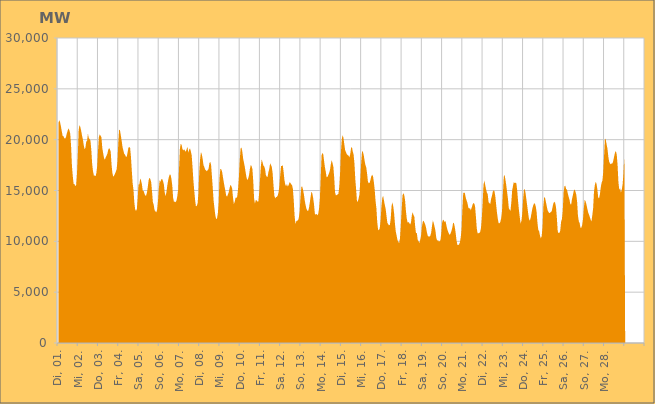
| Category | Series 0 |
|---|---|
|  Di, 01.  | 21647.382 |
|  Di, 01.  | 21924.594 |
|  Di, 01.  | 21709.314 |
|  Di, 01.  | 21294.105 |
|  Di, 01.  | 20818.8 |
|  Di, 01.  | 20381.168 |
|  Di, 01.  | 20331.088 |
|  Di, 01.  | 20152.958 |
|  Di, 01.  | 20108.019 |
|  Di, 01.  | 20274.073 |
|  Di, 01.  | 20621.172 |
|  Di, 01.  | 20891.026 |
|  Di, 01.  | 21119.57 |
|  Di, 01.  | 20923.959 |
|  Di, 01.  | 20590.216 |
|  Di, 01.  | 19414.576 |
|  Di, 01.  | 17480.923 |
|  Mi, 02.  | 16425.325 |
|  Mi, 02.  | 15656.243 |
|  Mi, 02.  | 15633.18 |
|  Mi, 02.  | 15427.669 |
|  Mi, 02.  | 15548.343 |
|  Mi, 02.  | 16637.939 |
|  Mi, 02.  | 18485.272 |
|  Mi, 02.  | 20947.899 |
|  Mi, 02.  | 21448.928 |
|  Mi, 02.  | 21230.439 |
|  Mi, 02.  | 20867.877 |
|  Mi, 02.  | 20397.562 |
|  Mi, 02.  | 20023.071 |
|  Mi, 02.  | 19468.186 |
|  Mi, 02.  | 19064.334 |
|  Mi, 02.  | 19200.474 |
|  Mi, 02.  | 19810.049 |
|  Mi, 02.  | 19894.203 |
|  Mi, 02.  | 20596.826 |
|  Mi, 02.  | 20157.907 |
|  Mi, 02.  | 20075.829 |
|  Mi, 02.  | 19888.825 |
|  Mi, 02.  | 18993.205 |
|  Mi, 02.  | 17620.818 |
|  Do, 03.  | 16895.106 |
|  Do, 03.  | 16479.599 |
|  Do, 03.  | 16473.779 |
|  Do, 03.  | 16400.937 |
|  Do, 03.  | 16718.662 |
|  Do, 03.  | 17426.035 |
|  Do, 03.  | 18963.022 |
|  Do, 03.  | 20262.915 |
|  Do, 03.  | 20519.092 |
|  Do, 03.  | 20385.887 |
|  Do, 03.  | 20235.364 |
|  Do, 03.  | 19189.385 |
|  Do, 03.  | 18699.432 |
|  Do, 03.  | 18212.272 |
|  Do, 03.  | 18027.207 |
|  Do, 03.  | 18242.721 |
|  Do, 03.  | 18424.277 |
|  Do, 03.  | 18601.874 |
|  Do, 03.  | 18983.966 |
|  Do, 03.  | 19169.987 |
|  Do, 03.  | 19069.583 |
|  Do, 03.  | 18812.379 |
|  Do, 03.  | 17520.781 |
|  Do, 03.  | 16715.254 |
|  Fr, 04.  | 16350.941 |
|  Fr, 04.  | 16457.751 |
|  Fr, 04.  | 16642.461 |
|  Fr, 04.  | 16826.842 |
|  Fr, 04.  | 17081.881 |
|  Fr, 04.  | 17864.784 |
|  Fr, 04.  | 19688.729 |
|  Fr, 04.  | 20986.734 |
|  Fr, 04.  | 20910.923 |
|  Fr, 04.  | 20420.928 |
|  Fr, 04.  | 19885.365 |
|  Fr, 04.  | 19273.606 |
|  Fr, 04.  | 18933.802 |
|  Fr, 04.  | 18609.294 |
|  Fr, 04.  | 18519.89 |
|  Fr, 04.  | 18317.522 |
|  Fr, 04.  | 18332.433 |
|  Fr, 04.  | 18739.221 |
|  Fr, 04.  | 19208.058 |
|  Fr, 04.  | 19278.517 |
|  Fr, 04.  | 19188.406 |
|  Fr, 04.  | 18313.067 |
|  Fr, 04.  | 16975.028 |
|  Fr, 04.  | 15734.214 |
|  Sa, 05.  | 15073.215 |
|  Sa, 05.  | 13826.937 |
|  Sa, 05.  | 13146.168 |
|  Sa, 05.  | 12989.51 |
|  Sa, 05.  | 13188.031 |
|  Sa, 05.  | 14250.862 |
|  Sa, 05.  | 15579.951 |
|  Sa, 05.  | 15614.937 |
|  Sa, 05.  | 16192.824 |
|  Sa, 05.  | 15970.28 |
|  Sa, 05.  | 15607.055 |
|  Sa, 05.  | 14961.727 |
|  Sa, 05.  | 14950.787 |
|  Sa, 05.  | 14699.195 |
|  Sa, 05.  | 14483.501 |
|  Sa, 05.  | 14516.205 |
|  Sa, 05.  | 14802.24 |
|  Sa, 05.  | 15371.821 |
|  Sa, 05.  | 16032.172 |
|  Sa, 05.  | 16255.178 |
|  Sa, 05.  | 16119.198 |
|  Sa, 05.  | 15805.163 |
|  Sa, 05.  | 14888.755 |
|  Sa, 05.  | 13863.611 |
|  So, 06.  | 13583.174 |
|  So, 06.  | 13062.539 |
|  So, 06.  | 12962.737 |
|  So, 06.  | 12839.903 |
|  So, 06.  | 13102.004 |
|  So, 06.  | 13899.438 |
|  So, 06.  | 15122.044 |
|  So, 06.  | 15992.378 |
|  So, 06.  | 15848.781 |
|  So, 06.  | 16106.19 |
|  So, 06.  | 16135.989 |
|  So, 06.  | 15925.278 |
|  So, 06.  | 15620.938 |
|  So, 06.  | 14829.078 |
|  So, 06.  | 14434.942 |
|  So, 06.  | 14802.797 |
|  So, 06.  | 15434.808 |
|  So, 06.  | 15951.464 |
|  So, 06.  | 16339.908 |
|  So, 06.  | 16584.075 |
|  So, 06.  | 16539.416 |
|  So, 06.  | 16148.309 |
|  So, 06.  | 15472.107 |
|  So, 06.  | 14276.879 |
|  Mo, 07.  | 13864.22 |
|  Mo, 07.  | 13922.796 |
|  Mo, 07.  | 13850.88 |
|  Mo, 07.  | 14017.996 |
|  Mo, 07.  | 14451.597 |
|  Mo, 07.  | 15100.453 |
|  Mo, 07.  | 17116.972 |
|  Mo, 07.  | 19071.451 |
|  Mo, 07.  | 19590.066 |
|  Mo, 07.  | 19498.177 |
|  Mo, 07.  | 19095.235 |
|  Mo, 07.  | 18927.247 |
|  Mo, 07.  | 19069.059 |
|  Mo, 07.  | 18917.665 |
|  Mo, 07.  | 18806.779 |
|  Mo, 07.  | 19063.222 |
|  Mo, 07.  | 19292.183 |
|  Mo, 07.  | 18718.956 |
|  Mo, 07.  | 19009.22 |
|  Mo, 07.  | 19146.582 |
|  Mo, 07.  | 18863.678 |
|  Mo, 07.  | 18462.515 |
|  Mo, 07.  | 17321.467 |
|  Mo, 07.  | 16014.796 |
|  Di, 08.  | 15031.501 |
|  Di, 08.  | 14110.373 |
|  Di, 08.  | 13456.405 |
|  Di, 08.  | 13474.461 |
|  Di, 08.  | 13717.189 |
|  Di, 08.  | 14689.085 |
|  Di, 08.  | 16834.872 |
|  Di, 08.  | 18091.872 |
|  Di, 08.  | 18777.328 |
|  Di, 08.  | 18563.255 |
|  Di, 08.  | 18117.438 |
|  Di, 08.  | 17493.964 |
|  Di, 08.  | 17304.059 |
|  Di, 08.  | 17055.066 |
|  Di, 08.  | 16967.131 |
|  Di, 08.  | 16895.187 |
|  Di, 08.  | 17007.212 |
|  Di, 08.  | 17125.69 |
|  Di, 08.  | 17679.714 |
|  Di, 08.  | 17814.447 |
|  Di, 08.  | 17537.798 |
|  Di, 08.  | 16418.18 |
|  Di, 08.  | 15249.092 |
|  Di, 08.  | 14001.512 |
|  Mi, 09.  | 13264.465 |
|  Mi, 09.  | 12583.615 |
|  Mi, 09.  | 12197.608 |
|  Mi, 09.  | 12248.391 |
|  Mi, 09.  | 12717.885 |
|  Mi, 09.  | 13805.939 |
|  Mi, 09.  | 16202.71 |
|  Mi, 09.  | 17112.278 |
|  Mi, 09.  | 17096.809 |
|  Mi, 09.  | 16867.138 |
|  Mi, 09.  | 16358.865 |
|  Mi, 09.  | 15850.386 |
|  Mi, 09.  | 15372.133 |
|  Mi, 09.  | 14942.417 |
|  Mi, 09.  | 14475.801 |
|  Mi, 09.  | 14407.27 |
|  Mi, 09.  | 14620.496 |
|  Mi, 09.  | 14842.471 |
|  Mi, 09.  | 15264.154 |
|  Mi, 09.  | 15564.447 |
|  Mi, 09.  | 15431.573 |
|  Mi, 09.  | 15179.759 |
|  Mi, 09.  | 14305.825 |
|  Mi, 09.  | 13668.996 |
|  Do, 10.  | 13875.519 |
|  Do, 10.  | 14293.174 |
|  Do, 10.  | 14271.768 |
|  Do, 10.  | 14386.692 |
|  Do, 10.  | 15153.697 |
|  Do, 10.  | 16319.373 |
|  Do, 10.  | 18001.158 |
|  Do, 10.  | 19117.569 |
|  Do, 10.  | 19232.245 |
|  Do, 10.  | 18857.538 |
|  Do, 10.  | 18160.432 |
|  Do, 10.  | 17744.402 |
|  Do, 10.  | 17303.408 |
|  Do, 10.  | 16777.248 |
|  Do, 10.  | 16282.428 |
|  Do, 10.  | 16025.547 |
|  Do, 10.  | 16186.261 |
|  Do, 10.  | 16512.235 |
|  Do, 10.  | 17102.39 |
|  Do, 10.  | 17501.986 |
|  Do, 10.  | 17408.855 |
|  Do, 10.  | 17114.141 |
|  Do, 10.  | 15924.647 |
|  Do, 10.  | 14226.712 |
|  Fr, 11.  | 13705.592 |
|  Fr, 11.  | 14058.838 |
|  Fr, 11.  | 14042.868 |
|  Fr, 11.  | 13915.292 |
|  Fr, 11.  | 13883.156 |
|  Fr, 11.  | 14741.415 |
|  Fr, 11.  | 16020.871 |
|  Fr, 11.  | 17354.857 |
|  Fr, 11.  | 18055.156 |
|  Fr, 11.  | 17793.744 |
|  Fr, 11.  | 17468.15 |
|  Fr, 11.  | 17366.93 |
|  Fr, 11.  | 17123.497 |
|  Fr, 11.  | 16512.652 |
|  Fr, 11.  | 16353.893 |
|  Fr, 11.  | 16337.599 |
|  Fr, 11.  | 16812.537 |
|  Fr, 11.  | 17112.818 |
|  Fr, 11.  | 17665.426 |
|  Fr, 11.  | 17527.426 |
|  Fr, 11.  | 17316.175 |
|  Fr, 11.  | 16693.461 |
|  Fr, 11.  | 15521.166 |
|  Fr, 11.  | 14509.934 |
|  Sa, 12.  | 14227.514 |
|  Sa, 12.  | 14347.255 |
|  Sa, 12.  | 14381.564 |
|  Sa, 12.  | 14497.925 |
|  Sa, 12.  | 14803.936 |
|  Sa, 12.  | 15479.31 |
|  Sa, 12.  | 16540.263 |
|  Sa, 12.  | 17417.751 |
|  Sa, 12.  | 17414.688 |
|  Sa, 12.  | 17484.71 |
|  Sa, 12.  | 16841.518 |
|  Sa, 12.  | 16019.939 |
|  Sa, 12.  | 15570.544 |
|  Sa, 12.  | 15434.521 |
|  Sa, 12.  | 15641.264 |
|  Sa, 12.  | 15394.087 |
|  Sa, 12.  | 15557.336 |
|  Sa, 12.  | 15807.191 |
|  Sa, 12.  | 15755.996 |
|  Sa, 12.  | 15614.142 |
|  Sa, 12.  | 15539.582 |
|  Sa, 12.  | 15159.591 |
|  Sa, 12.  | 14059.037 |
|  Sa, 12.  | 12541.84 |
|  So, 13.  | 11725.372 |
|  So, 13.  | 11952.351 |
|  So, 13.  | 12051.085 |
|  So, 13.  | 12056.506 |
|  So, 13.  | 12289.501 |
|  So, 13.  | 12935.653 |
|  So, 13.  | 14279.327 |
|  So, 13.  | 15350.799 |
|  So, 13.  | 15401.172 |
|  So, 13.  | 15092.121 |
|  So, 13.  | 14648.718 |
|  So, 13.  | 14054.978 |
|  So, 13.  | 13593.78 |
|  So, 13.  | 13227.322 |
|  So, 13.  | 13032.57 |
|  So, 13.  | 12970.881 |
|  So, 13.  | 13253.171 |
|  So, 13.  | 13761.175 |
|  So, 13.  | 14360.168 |
|  So, 13.  | 14893.073 |
|  So, 13.  | 14724.573 |
|  So, 13.  | 14281.528 |
|  So, 13.  | 13673.685 |
|  So, 13.  | 12761.172 |
|  Mo, 14.  | 12598.055 |
|  Mo, 14.  | 12714.341 |
|  Mo, 14.  | 12553.454 |
|  Mo, 14.  | 12706.545 |
|  Mo, 14.  | 13190.024 |
|  Mo, 14.  | 14162.038 |
|  Mo, 14.  | 16227.041 |
|  Mo, 14.  | 18434.471 |
|  Mo, 14.  | 18694.304 |
|  Mo, 14.  | 18565.88 |
|  Mo, 14.  | 17903.078 |
|  Mo, 14.  | 17278.436 |
|  Mo, 14.  | 16842.372 |
|  Mo, 14.  | 16308.302 |
|  Mo, 14.  | 16332.108 |
|  Mo, 14.  | 16537.321 |
|  Mo, 14.  | 16726.971 |
|  Mo, 14.  | 17030.077 |
|  Mo, 14.  | 17586.473 |
|  Mo, 14.  | 17982.098 |
|  Mo, 14.  | 17701.961 |
|  Mo, 14.  | 17320.135 |
|  Mo, 14.  | 16266.186 |
|  Mo, 14.  | 14809.015 |
|  Di, 15.  | 14522.789 |
|  Di, 15.  | 14554.233 |
|  Di, 15.  | 14614.662 |
|  Di, 15.  | 14682.728 |
|  Di, 15.  | 15386.58 |
|  Di, 15.  | 16769.18 |
|  Di, 15.  | 18834.725 |
|  Di, 15.  | 20057.012 |
|  Di, 15.  | 20444.541 |
|  Di, 15.  | 20169.485 |
|  Di, 15.  | 19524.191 |
|  Di, 15.  | 18963.414 |
|  Di, 15.  | 18754.175 |
|  Di, 15.  | 18569.478 |
|  Di, 15.  | 18478.207 |
|  Di, 15.  | 18427.359 |
|  Di, 15.  | 18261.085 |
|  Di, 15.  | 18581.723 |
|  Di, 15.  | 19167.789 |
|  Di, 15.  | 19285.603 |
|  Di, 15.  | 18829.329 |
|  Di, 15.  | 18539.425 |
|  Di, 15.  | 17661.985 |
|  Di, 15.  | 16123.459 |
|  Mi, 16.  | 15099.376 |
|  Mi, 16.  | 13909.412 |
|  Mi, 16.  | 13922.851 |
|  Mi, 16.  | 14222.198 |
|  Mi, 16.  | 14646.028 |
|  Mi, 16.  | 16161.638 |
|  Mi, 16.  | 17769.606 |
|  Mi, 16.  | 18857.937 |
|  Mi, 16.  | 18821.583 |
|  Mi, 16.  | 18476.907 |
|  Mi, 16.  | 17943.143 |
|  Mi, 16.  | 17513.804 |
|  Mi, 16.  | 17278.224 |
|  Mi, 16.  | 16642.961 |
|  Mi, 16.  | 15867.54 |
|  Mi, 16.  | 15716.885 |
|  Mi, 16.  | 15760.006 |
|  Mi, 16.  | 16044.298 |
|  Mi, 16.  | 16411.108 |
|  Mi, 16.  | 16543.577 |
|  Mi, 16.  | 16415.772 |
|  Mi, 16.  | 15834.362 |
|  Mi, 16.  | 15087.013 |
|  Mi, 16.  | 13984.838 |
|  Do, 17.  | 13276.2 |
|  Do, 17.  | 11908.005 |
|  Do, 17.  | 11170.978 |
|  Do, 17.  | 11088.401 |
|  Do, 17.  | 11298.597 |
|  Do, 17.  | 12063.989 |
|  Do, 17.  | 13416.893 |
|  Do, 17.  | 14255.775 |
|  Do, 17.  | 14463.223 |
|  Do, 17.  | 14017.464 |
|  Do, 17.  | 13572.83 |
|  Do, 17.  | 13204.223 |
|  Do, 17.  | 12494.624 |
|  Do, 17.  | 11837.412 |
|  Do, 17.  | 11688.619 |
|  Do, 17.  | 11570.792 |
|  Do, 17.  | 11629.498 |
|  Do, 17.  | 12223.612 |
|  Do, 17.  | 13476.252 |
|  Do, 17.  | 13835.226 |
|  Do, 17.  | 13446.016 |
|  Do, 17.  | 12776.935 |
|  Do, 17.  | 11747.773 |
|  Do, 17.  | 10957.524 |
|  Fr, 18.  | 10569.115 |
|  Fr, 18.  | 10132.207 |
|  Fr, 18.  | 9945.918 |
|  Fr, 18.  | 9837.105 |
|  Fr, 18.  | 10305.558 |
|  Fr, 18.  | 11661.074 |
|  Fr, 18.  | 13122.842 |
|  Fr, 18.  | 14530.161 |
|  Fr, 18.  | 14740.694 |
|  Fr, 18.  | 14566.008 |
|  Fr, 18.  | 14048.888 |
|  Fr, 18.  | 13033.217 |
|  Fr, 18.  | 12253.149 |
|  Fr, 18.  | 11850.486 |
|  Fr, 18.  | 11895.892 |
|  Fr, 18.  | 11808.691 |
|  Fr, 18.  | 11656.047 |
|  Fr, 18.  | 11838.785 |
|  Fr, 18.  | 12536.14 |
|  Fr, 18.  | 12856.953 |
|  Fr, 18.  | 12589.658 |
|  Fr, 18.  | 12432.312 |
|  Fr, 18.  | 11471.864 |
|  Fr, 18.  | 10782.175 |
|  Sa, 19.  | 10827.625 |
|  Sa, 19.  | 10130.449 |
|  Sa, 19.  | 10013.473 |
|  Sa, 19.  | 9840.61 |
|  Sa, 19.  | 10149.325 |
|  Sa, 19.  | 10586.533 |
|  Sa, 19.  | 11447.685 |
|  Sa, 19.  | 11935.168 |
|  Sa, 19.  | 12035.528 |
|  Sa, 19.  | 11834.306 |
|  Sa, 19.  | 11647.95 |
|  Sa, 19.  | 11297.395 |
|  Sa, 19.  | 10849.612 |
|  Sa, 19.  | 10525.268 |
|  Sa, 19.  | 10469.355 |
|  Sa, 19.  | 10461.998 |
|  Sa, 19.  | 10558.761 |
|  Sa, 19.  | 10876.357 |
|  Sa, 19.  | 11543.417 |
|  Sa, 19.  | 12050.587 |
|  Sa, 19.  | 11801.328 |
|  Sa, 19.  | 11440.297 |
|  Sa, 19.  | 11060.909 |
|  Sa, 19.  | 10371.281 |
|  So, 20.  | 10067.154 |
|  So, 20.  | 10134.239 |
|  So, 20.  | 9990.262 |
|  So, 20.  | 10003.207 |
|  So, 20.  | 10128.365 |
|  So, 20.  | 10838.826 |
|  So, 20.  | 11869.502 |
|  So, 20.  | 12129.756 |
|  So, 20.  | 12059.67 |
|  So, 20.  | 11900.713 |
|  So, 20.  | 12001.138 |
|  So, 20.  | 11570.132 |
|  So, 20.  | 11210.909 |
|  So, 20.  | 10949.964 |
|  So, 20.  | 10765.259 |
|  So, 20.  | 10620.183 |
|  So, 20.  | 10793.929 |
|  So, 20.  | 11015.443 |
|  So, 20.  | 11339.743 |
|  So, 20.  | 11823.918 |
|  So, 20.  | 11779.674 |
|  So, 20.  | 11388.584 |
|  So, 20.  | 10830.117 |
|  So, 20.  | 10107.549 |
|  Mo, 21.  | 9675.321 |
|  Mo, 21.  | 9624.826 |
|  Mo, 21.  | 9696.119 |
|  Mo, 21.  | 9887.273 |
|  Mo, 21.  | 10372.599 |
|  Mo, 21.  | 11210.857 |
|  Mo, 21.  | 13212.457 |
|  Mo, 21.  | 14757.422 |
|  Mo, 21.  | 14798.669 |
|  Mo, 21.  | 14720.753 |
|  Mo, 21.  | 14270.093 |
|  Mo, 21.  | 14029.628 |
|  Mo, 21.  | 13759.349 |
|  Mo, 21.  | 13326.79 |
|  Mo, 21.  | 13215.032 |
|  Mo, 21.  | 13264.442 |
|  Mo, 21.  | 13057.389 |
|  Mo, 21.  | 13307.968 |
|  Mo, 21.  | 13594.932 |
|  Mo, 21.  | 13767.681 |
|  Mo, 21.  | 13725.863 |
|  Mo, 21.  | 13446.775 |
|  Mo, 21.  | 12442.451 |
|  Mo, 21.  | 11304.256 |
|  Di, 22.  | 10799.978 |
|  Di, 22.  | 10802.489 |
|  Di, 22.  | 10816.333 |
|  Di, 22.  | 10918.336 |
|  Di, 22.  | 11288.216 |
|  Di, 22.  | 12277.135 |
|  Di, 22.  | 13693.782 |
|  Di, 22.  | 15550.99 |
|  Di, 22.  | 15981.981 |
|  Di, 22.  | 15566.453 |
|  Di, 22.  | 15135.568 |
|  Di, 22.  | 14796.473 |
|  Di, 22.  | 14637.867 |
|  Di, 22.  | 13864.804 |
|  Di, 22.  | 13764.295 |
|  Di, 22.  | 13654.588 |
|  Di, 22.  | 14164.905 |
|  Di, 22.  | 14472.022 |
|  Di, 22.  | 14870.287 |
|  Di, 22.  | 15029.818 |
|  Di, 22.  | 14930.44 |
|  Di, 22.  | 14427.711 |
|  Di, 22.  | 13609.408 |
|  Di, 22.  | 12813.666 |
|  Mi, 23.  | 12203.665 |
|  Mi, 23.  | 11776.605 |
|  Mi, 23.  | 11774.794 |
|  Mi, 23.  | 11921.477 |
|  Mi, 23.  | 12282.812 |
|  Mi, 23.  | 13007.714 |
|  Mi, 23.  | 14656.193 |
|  Mi, 23.  | 16323.074 |
|  Mi, 23.  | 16561.241 |
|  Mi, 23.  | 16069.611 |
|  Mi, 23.  | 15520.678 |
|  Mi, 23.  | 14838.461 |
|  Mi, 23.  | 14172.68 |
|  Mi, 23.  | 13278.553 |
|  Mi, 23.  | 13119.829 |
|  Mi, 23.  | 12981.524 |
|  Mi, 23.  | 13850.747 |
|  Mi, 23.  | 14991.703 |
|  Mi, 23.  | 15473.741 |
|  Mi, 23.  | 15827.347 |
|  Mi, 23.  | 15730.918 |
|  Mi, 23.  | 15781.953 |
|  Mi, 23.  | 15688.12 |
|  Mi, 23.  | 14991.397 |
|  Do, 24.  | 13958.863 |
|  Do, 24.  | 13090.752 |
|  Do, 24.  | 12387.142 |
|  Do, 24.  | 11749.593 |
|  Do, 24.  | 12014.826 |
|  Do, 24.  | 12755.46 |
|  Do, 24.  | 14128.767 |
|  Do, 24.  | 15119.735 |
|  Do, 24.  | 15105.223 |
|  Do, 24.  | 14675.961 |
|  Do, 24.  | 14042.102 |
|  Do, 24.  | 13396.555 |
|  Do, 24.  | 12745.669 |
|  Do, 24.  | 12177.816 |
|  Do, 24.  | 12038.022 |
|  Do, 24.  | 12331.819 |
|  Do, 24.  | 12797.274 |
|  Do, 24.  | 13242.652 |
|  Do, 24.  | 13547.548 |
|  Do, 24.  | 13741.41 |
|  Do, 24.  | 13698.58 |
|  Do, 24.  | 13422.989 |
|  Do, 24.  | 12873.563 |
|  Do, 24.  | 11802.108 |
|  Fr, 25.  | 11124.035 |
|  Fr, 25.  | 10987.598 |
|  Fr, 25.  | 10554.859 |
|  Fr, 25.  | 10283.116 |
|  Fr, 25.  | 10524.886 |
|  Fr, 25.  | 11421.619 |
|  Fr, 25.  | 13436.285 |
|  Fr, 25.  | 14370.203 |
|  Fr, 25.  | 14275.24 |
|  Fr, 25.  | 13875.568 |
|  Fr, 25.  | 13476.628 |
|  Fr, 25.  | 13058.371 |
|  Fr, 25.  | 12896.135 |
|  Fr, 25.  | 12775.971 |
|  Fr, 25.  | 12826.123 |
|  Fr, 25.  | 12893.06 |
|  Fr, 25.  | 12988.023 |
|  Fr, 25.  | 13422.942 |
|  Fr, 25.  | 13766.691 |
|  Fr, 25.  | 13892.358 |
|  Fr, 25.  | 13779.62 |
|  Fr, 25.  | 13363.602 |
|  Fr, 25.  | 12315.866 |
|  Fr, 25.  | 11001.318 |
|  Sa, 26.  | 10804.038 |
|  Sa, 26.  | 10843.611 |
|  Sa, 26.  | 11036.68 |
|  Sa, 26.  | 11923.53 |
|  Sa, 26.  | 12178.082 |
|  Sa, 26.  | 13039.799 |
|  Sa, 26.  | 14805.569 |
|  Sa, 26.  | 15426.349 |
|  Sa, 26.  | 15479.268 |
|  Sa, 26.  | 15128.926 |
|  Sa, 26.  | 15095.618 |
|  Sa, 26.  | 14692.414 |
|  Sa, 26.  | 14364.194 |
|  Sa, 26.  | 14099.227 |
|  Sa, 26.  | 13641.296 |
|  Sa, 26.  | 13645.932 |
|  Sa, 26.  | 14185.182 |
|  Sa, 26.  | 14534.389 |
|  Sa, 26.  | 14944.656 |
|  Sa, 26.  | 15113.9 |
|  Sa, 26.  | 14901.62 |
|  Sa, 26.  | 14604.5 |
|  Sa, 26.  | 13906.611 |
|  Sa, 26.  | 12528.006 |
|  So, 27.  | 11979.363 |
|  So, 27.  | 11795.514 |
|  So, 27.  | 11337.609 |
|  So, 27.  | 11339.189 |
|  So, 27.  | 11603.374 |
|  So, 27.  | 12187.207 |
|  So, 27.  | 13288.986 |
|  So, 27.  | 14098.38 |
|  So, 27.  | 13949.112 |
|  So, 27.  | 13654.392 |
|  So, 27.  | 13243.614 |
|  So, 27.  | 12878.762 |
|  So, 27.  | 12641.967 |
|  So, 27.  | 12418.921 |
|  So, 27.  | 12141.391 |
|  So, 27.  | 11952.077 |
|  So, 27.  | 12546.743 |
|  So, 27.  | 13253.145 |
|  So, 27.  | 14861.731 |
|  So, 27.  | 15510.208 |
|  So, 27.  | 15862.359 |
|  So, 27.  | 15666.93 |
|  So, 27.  | 15127.109 |
|  So, 27.  | 14324.135 |
|  Mo, 28.  | 14225.968 |
|  Mo, 28.  | 14614.138 |
|  Mo, 28.  | 15278.604 |
|  Mo, 28.  | 15756.259 |
|  Mo, 28.  | 15971.358 |
|  Mo, 28.  | 16813.232 |
|  Mo, 28.  | 18483.565 |
|  Mo, 28.  | 20122.028 |
|  Mo, 28.  | 19995.377 |
|  Mo, 28.  | 19532.233 |
|  Mo, 28.  | 19102.948 |
|  Mo, 28.  | 18337.82 |
|  Mo, 28.  | 17846.754 |
|  Mo, 28.  | 17653.809 |
|  Mo, 28.  | 17585.012 |
|  Mo, 28.  | 17673.95 |
|  Mo, 28.  | 17663.318 |
|  Mo, 28.  | 17973.424 |
|  Mo, 28.  | 18374.811 |
|  Mo, 28.  | 18756.535 |
|  Mo, 28.  | 18869.879 |
|  Mo, 28.  | 18514.944 |
|  Mo, 28.  | 17494.297 |
|  Mo, 28.  | 15796.268 |
|  Di, 01.  | 15073.779 |
|  Di, 01.  | 15205.783 |
|  Di, 01.  | 14787.705 |
|  Di, 01.  | 15096.053 |
|  Di, 01.  | 15637.196 |
|  Di, 01.  | 16720.972 |
|    | 18488.489 |
|    | 0 |
|    | 0 |
|    | 0 |
|    | 0 |
|    | 0 |
|    | 0 |
|    | 0 |
|    | 0 |
|    | 0 |
|    | 0 |
|    | 0 |
|    | 0 |
|    | 0 |
|    | 0 |
|    | 0 |
|    | 0 |
|    | 0 |
|    | 0 |
|    | 0 |
|    | 0 |
|    | 0 |
|    | 0 |
|    | 0 |
|    | 0 |